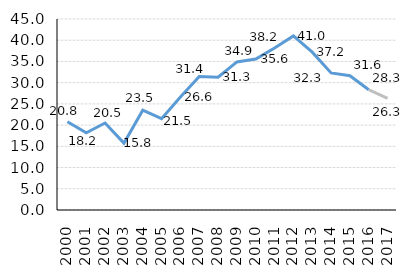
| Category | daňová medzera na DPH  |
|---|---|
| 2000.0 | 20.776 |
| 2001.0 | 18.188 |
| 2002.0 | 20.493 |
| 2003.0 | 15.756 |
| 2004.0 | 23.506 |
| 2005.0 | 21.513 |
| 2006.0 | 26.621 |
| 2007.0 | 31.445 |
| 2008.0 | 31.291 |
| 2009.0 | 34.886 |
| 2010.0 | 35.57 |
| 2011.0 | 38.17 |
| 2012.0 | 41.026 |
| 2013.0 | 37.189 |
| 2014.0 | 32.297 |
| 2015.0 | 31.645 |
| 2016.0 | 28.334 |
| 2017.0 | 26.304 |